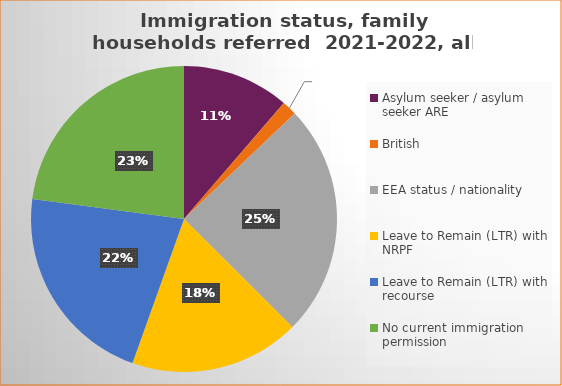
| Category | Number  | Percentage |
|---|---|---|
| Asylum seeker / asylum seeker ARE | 325 | 0.113 |
| British | 45 | 0.016 |
| EEA status / nationality  | 706 | 0.246 |
| Leave to Remain (LTR) with NRPF | 517 | 0.18 |
| Leave to Remain (LTR) with recourse | 621 | 0.216 |
| No current immigration permission | 658 | 0.229 |